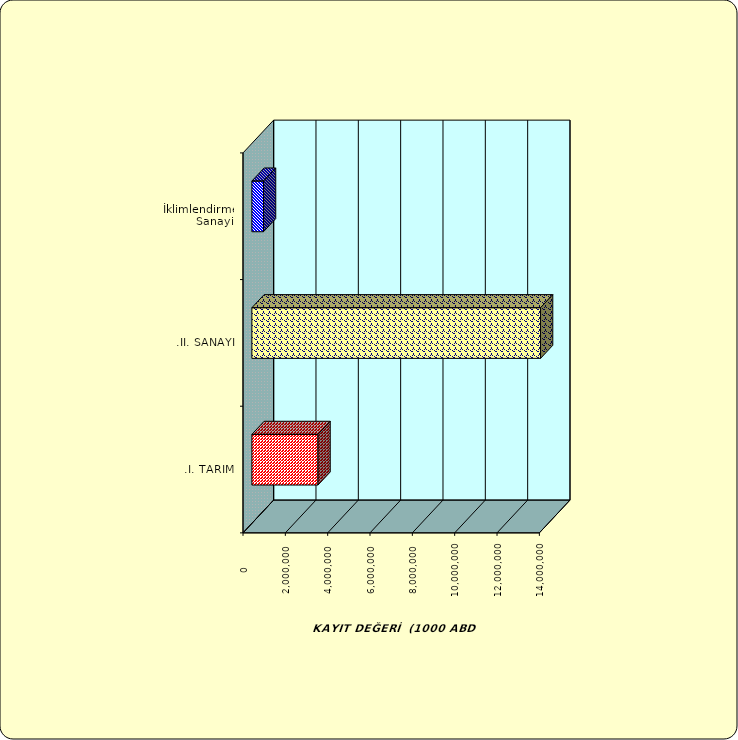
| Category | Series 0 |
|---|---|
| .I. TARIM | 3123678.259 |
| .II. SANAYİ | 13637306.66 |
|  İklimlendirme Sanayii | 549438.718 |